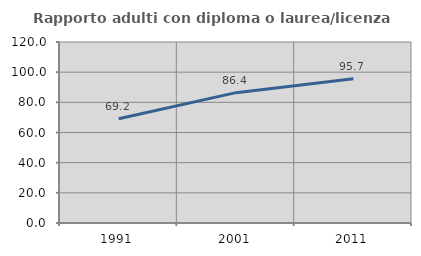
| Category | Rapporto adulti con diploma o laurea/licenza media  |
|---|---|
| 1991.0 | 69.173 |
| 2001.0 | 86.413 |
| 2011.0 | 95.652 |